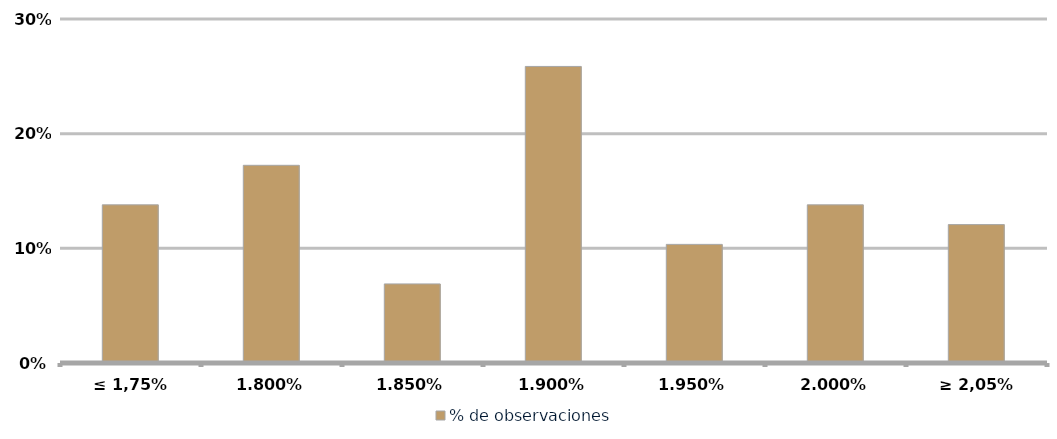
| Category | % de observaciones  |
|---|---|
| ≤ 1,75% | 0.138 |
| 1,80% | 0.172 |
| 1,85% | 0.069 |
| 1,90% | 0.259 |
| 1,95% | 0.103 |
| 2,00% | 0.138 |
| ≥ 2,05% | 0.121 |